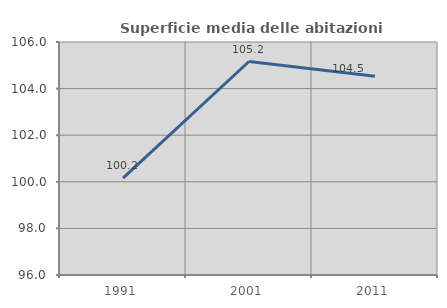
| Category | Superficie media delle abitazioni occupate |
|---|---|
| 1991.0 | 100.162 |
| 2001.0 | 105.163 |
| 2011.0 | 104.535 |